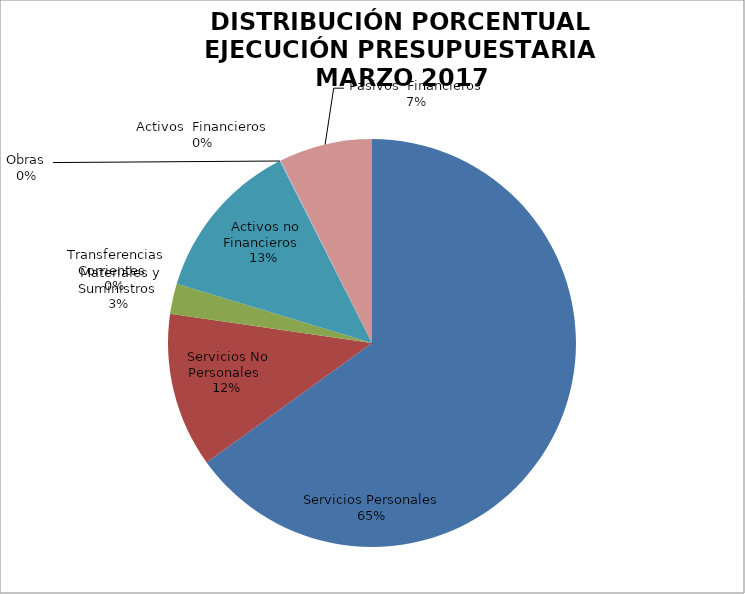
| Category | Series 0 | Series 1 |
|---|---|---|
| Servicios Personales | 21143083.52 | 0.763 |
| Servicios No Personales | 3978607.52 | 0.144 |
| Materiales y Suministros | 778960.27 | 0.028 |
| Transferencias Corrientes | 0 | 0 |
| Activos no Financieros | 4179177.63 | 0.151 |
| Obras | 0 | 0 |
| Activos  Financieros | 27200 | 0.001 |
| Pasivos  Financieros | -2398158.01 | -0.087 |